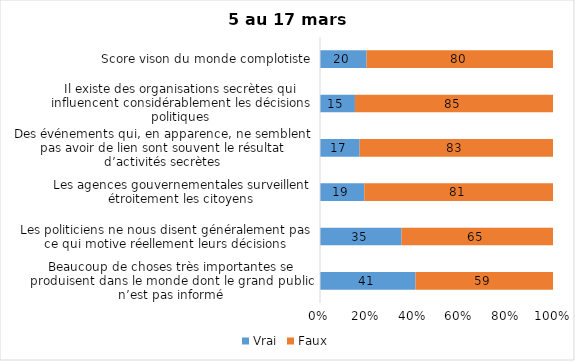
| Category | Vrai | Faux |
|---|---|---|
| Beaucoup de choses très importantes se produisent dans le monde dont le grand public n’est pas informé | 41 | 59 |
| Les politiciens ne nous disent généralement pas ce qui motive réellement leurs décisions | 35 | 65 |
| Les agences gouvernementales surveillent étroitement les citoyens | 19 | 81 |
| Des événements qui, en apparence, ne semblent pas avoir de lien sont souvent le résultat d’activités secrètes | 17 | 83 |
| Il existe des organisations secrètes qui influencent considérablement les décisions politiques | 15 | 85 |
| Score vison du monde complotiste | 20 | 80 |